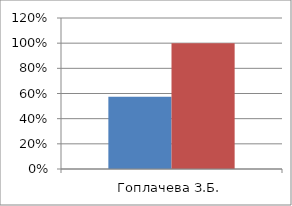
| Category | Series 0 | 2 |
|---|---|---|
| Гоплачева З.Б. | 0.574 | 1 |